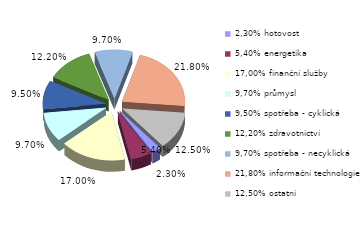
| Category | Series 0 |
|---|---|
| 2,30% hotovost | 0.023 |
| 5,40% energetika | 0.054 |
| 17,00% finanční služby | 0.17 |
| 9,70% průmysl | 0.097 |
| 9,50% spotřeba - cyklická | 0.095 |
| 12,20% zdravotnictví | 0.122 |
| 9,70% spotřeba - necyklická | 0.097 |
| 21,80% informační technologie | 0.218 |
| 12,50% ostatní | 0.125 |